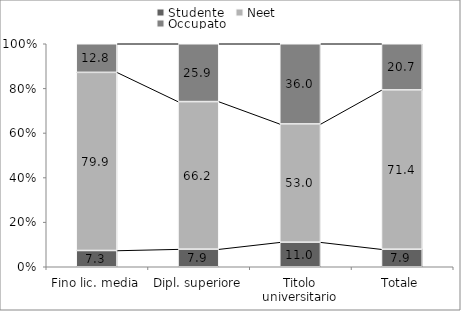
| Category | Studente | Neet | Occupato |
|---|---|---|---|
| Fino lic. media | 7.289 | 79.888 | 12.823 |
| Dipl. superiore | 7.89 | 66.175 | 25.935 |
| Titolo universitario | 11.012 | 53.032 | 35.956 |
| Totale | 7.859 | 71.437 | 20.704 |